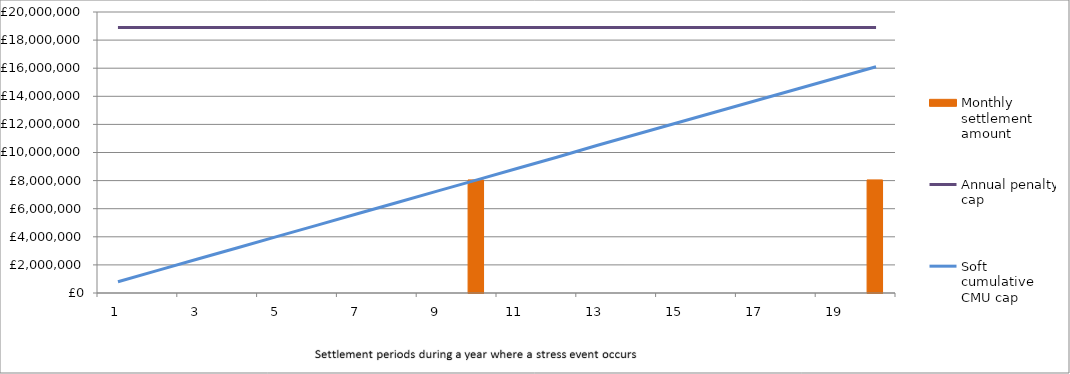
| Category | Monthly settlement amount  |
|---|---|
| 0 | 0 |
| 1 | 0 |
| 2 | 0 |
| 3 | 0 |
| 4 | 0 |
| 5 | 0 |
| 6 | 0 |
| 7 | 0 |
| 8 | 0 |
| 9 | 8050000 |
| 10 | 0 |
| 11 | 0 |
| 12 | 0 |
| 13 | 0 |
| 14 | 0 |
| 15 | 0 |
| 16 | 0 |
| 17 | 0 |
| 18 | 0 |
| 19 | 8050000 |